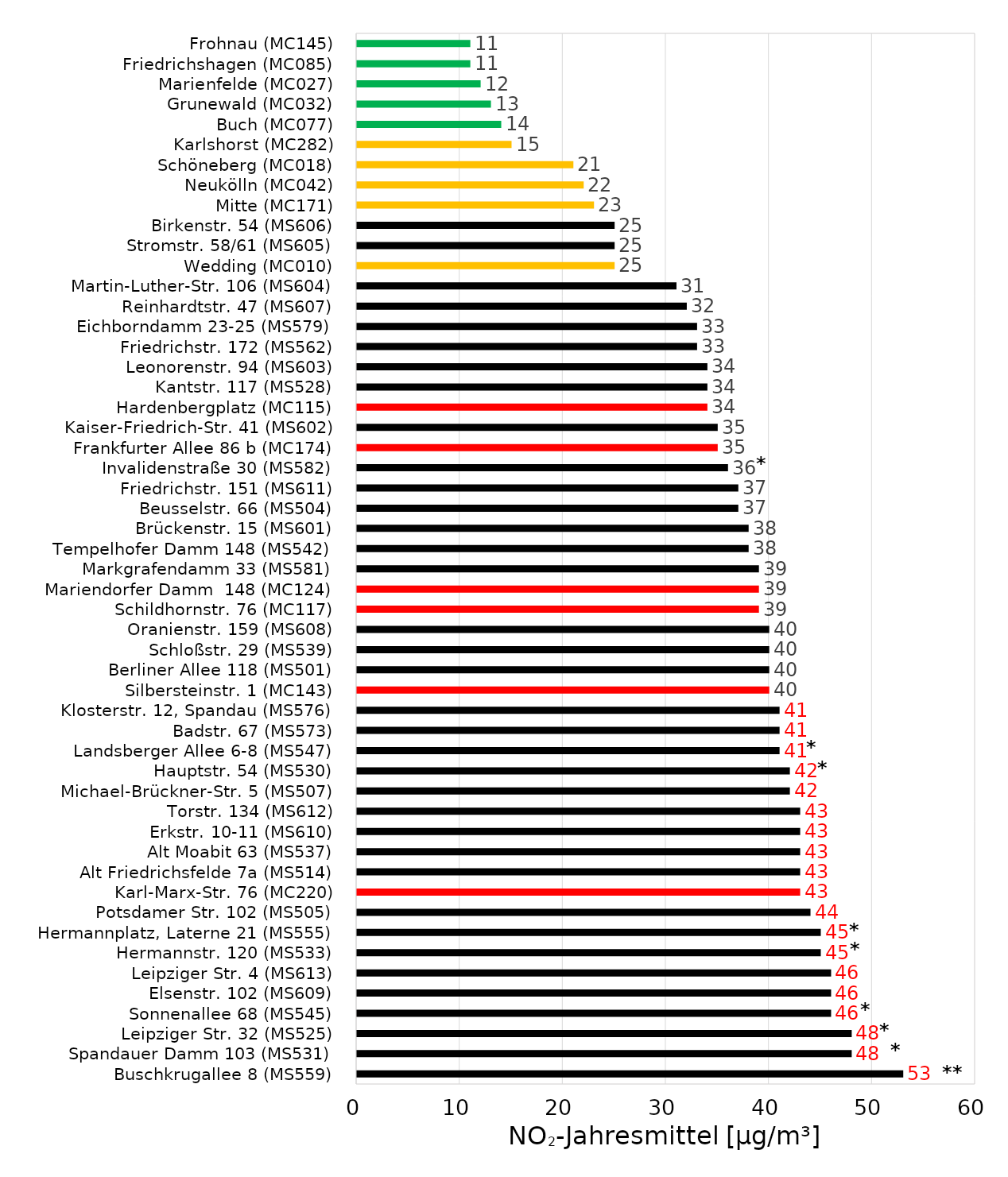
| Category | Series 0 |
|---|---|
| Buschkrugallee 8 (MS559) | 53 |
| Spandauer Damm 103 (MS531) | 48 |
| Leipziger Str. 32 (MS525) | 48 |
| Sonnenallee 68 (MS545) | 46 |
| Elsenstr. 102 (MS609) | 46 |
| Leipziger Str. 4 (MS613) | 46 |
| Hermannstr. 120 (MS533) | 45 |
| Hermannplatz, Laterne 21 (MS555) | 45 |
| Potsdamer Str. 102 (MS505) | 44 |
| Karl-Marx-Str. 76 (MC220) | 43 |
| Alt Friedrichsfelde 7a (MS514) | 43 |
| Alt Moabit 63 (MS537) | 43 |
| Erkstr. 10-11 (MS610) | 43 |
| Torstr. 134 (MS612) | 43 |
| Michael-Brückner-Str. 5 (MS507) | 42 |
| Hauptstr. 54 (MS530) | 42 |
| Landsberger Allee 6-8 (MS547) | 41 |
| Badstr. 67 (MS573) | 41 |
| Klosterstr. 12, Spandau (MS576) | 41 |
| Silbersteinstr. 1 (MC143) | 40 |
| Berliner Allee 118 (MS501) | 40 |
| Schloßstr. 29 (MS539) | 40 |
| Oranienstr. 159 (MS608) | 40 |
| Schildhornstr. 76 (MC117) | 39 |
| Mariendorfer Damm  148 (MC124) | 39 |
| Markgrafendamm 33 (MS581) | 39 |
| Tempelhofer Damm 148 (MS542) | 38 |
| Brückenstr. 15 (MS601) | 38 |
| Beusselstr. 66 (MS504) | 37 |
| Friedrichstr. 151 (MS611) | 37 |
| Invalidenstraße 30 (MS582) | 36 |
| Frankfurter Allee 86 b (MC174) | 35 |
| Kaiser-Friedrich-Str. 41 (MS602) | 35 |
| Hardenbergplatz (MC115) | 34 |
| Kantstr. 117 (MS528) | 34 |
| Leonorenstr. 94 (MS603) | 34 |
| Friedrichstr. 172 (MS562) | 33 |
| Eichborndamm 23-25 (MS579) | 33 |
| Reinhardtstr. 47 (MS607) | 32 |
| Martin-Luther-Str. 106 (MS604) | 31 |
| Wedding (MC010) | 25 |
| Stromstr. 58/61 (MS605) | 25 |
| Birkenstr. 54 (MS606) | 25 |
| Mitte (MC171) | 23 |
| Neukölln (MC042) | 22 |
| Schöneberg (MC018) | 21 |
| Karlshorst (MC282) | 15 |
| Buch (MC077) | 14 |
| Grunewald (MC032) | 13 |
| Marienfelde (MC027) | 12 |
| Friedrichshagen (MC085) | 11 |
| Frohnau (MC145) | 11 |